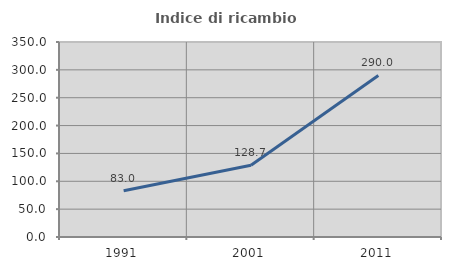
| Category | Indice di ricambio occupazionale  |
|---|---|
| 1991.0 | 82.952 |
| 2001.0 | 128.662 |
| 2011.0 | 289.985 |